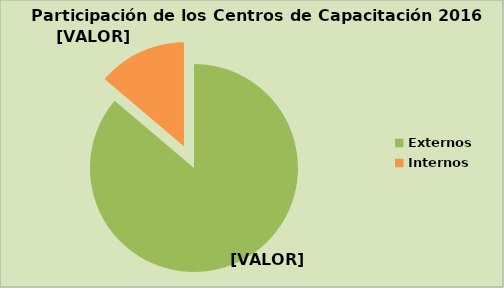
| Category | Series 0 |
|---|---|
| Externos | 86.179 |
| Internos | 13.821 |